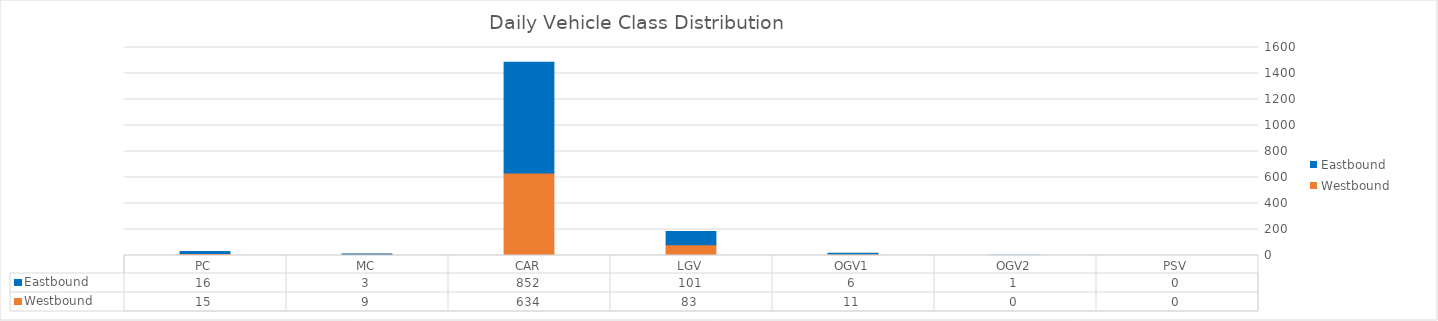
| Category | Westbound | Eastbound |
|---|---|---|
| PC | 15 | 16 |
| MC | 9 | 3 |
| CAR | 634 | 852 |
| LGV | 83 | 101 |
| OGV1 | 11 | 6 |
| OGV2 | 0 | 1 |
| PSV | 0 | 0 |